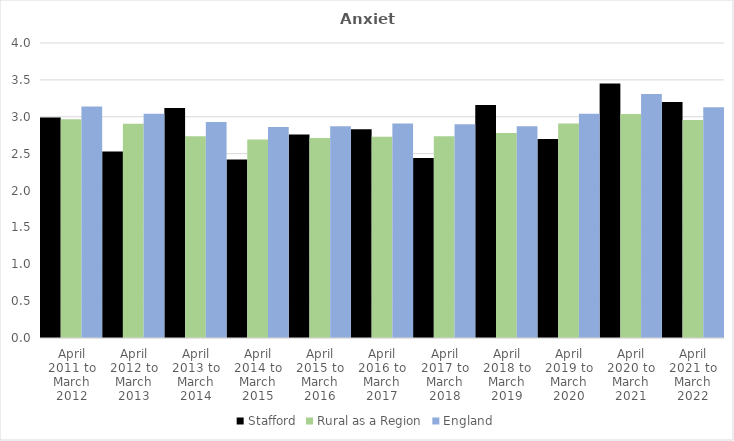
| Category | Stafford | Rural as a Region | England |
|---|---|---|---|
| April 2011 to March 2012 | 2.99 | 2.967 | 3.14 |
| April 2012 to March 2013 | 2.53 | 2.904 | 3.04 |
| April 2013 to March 2014 | 3.12 | 2.734 | 2.93 |
| April 2014 to March 2015 | 2.42 | 2.691 | 2.86 |
| April 2015 to March 2016 | 2.76 | 2.711 | 2.87 |
| April 2016 to March 2017 | 2.83 | 2.729 | 2.91 |
| April 2017 to March 2018 | 2.44 | 2.736 | 2.9 |
| April 2018 to March 2019 | 3.16 | 2.78 | 2.87 |
| April 2019 to March 2020 | 2.7 | 2.908 | 3.04 |
| April 2020 to March 2021 | 3.45 | 3.036 | 3.31 |
| April 2021 to March 2022 | 3.2 | 2.956 | 3.13 |